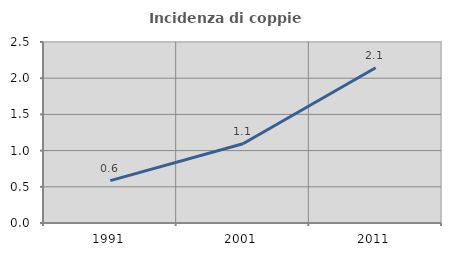
| Category | Incidenza di coppie miste |
|---|---|
| 1991.0 | 0.586 |
| 2001.0 | 1.095 |
| 2011.0 | 2.145 |